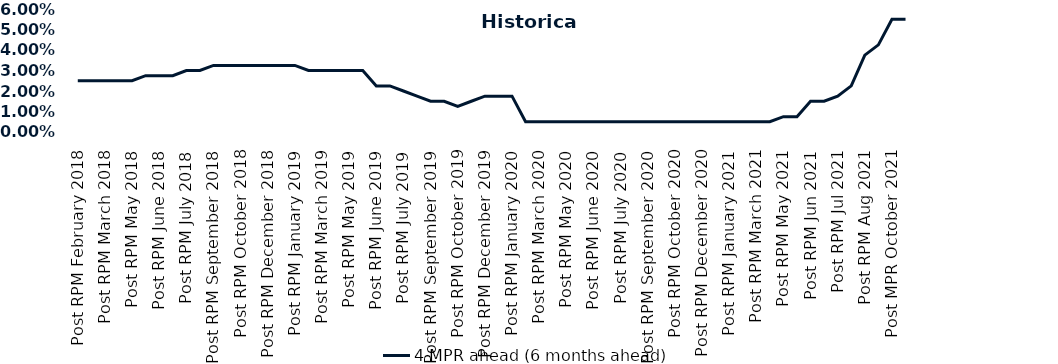
| Category | 4 MPR ahead (6 months ahead) |
|---|---|
| Post RPM February 2018 | 0.025 |
| Pre RPM March 2018 | 0.025 |
| Post RPM March 2018 | 0.025 |
| Pre RPM May 2018 | 0.025 |
| Post RPM May 2018 | 0.025 |
| Pre RPM June 2018 | 0.028 |
| Post RPM June 2018 | 0.028 |
| Pre RPM July 2018 | 0.028 |
| Post RPM July 2018 | 0.03 |
| Pre RPM September 2018 | 0.03 |
| Post RPM September 2018 | 0.032 |
| Pre RPM October 2018 | 0.032 |
| Post RPM October 2018 | 0.032 |
| Pre RPM December 2018 | 0.032 |
| Post RPM December 2018 | 0.032 |
| Pre RPM January 2019 | 0.032 |
| Post RPM January 2019 | 0.032 |
| Pre RPM March 2019 | 0.03 |
| Post RPM March 2019 | 0.03 |
| Pre RPM May 2019 | 0.03 |
| Post RPM May 2019 | 0.03 |
| Pre RPM June 2019 | 0.03 |
| Post RPM June 2019 | 0.022 |
| Pre RPM July 2019 | 0.022 |
| Post RPM July 2019 | 0.02 |
| Pre RPM September 2019 | 0.018 |
| Post RPM September 2019 | 0.015 |
| Pre RPM October 2019 | 0.015 |
| Post RPM October 2019 | 0.012 |
| Pre RPM December 2019 | 0.015 |
| Post RPM December 2019 | 0.018 |
| Pre RPM January 2020 | 0.018 |
| Post RPM January 2020 | 0.018 |
| Pre RPM March 2020 | 0.005 |
| Post RPM March 2020 | 0.005 |
| Pre RPM May 2020 | 0.005 |
| Post RPM May 2020 | 0.005 |
| Pre RPM June 2020 | 0.005 |
| Post RPM June 2020 | 0.005 |
| Pre RPM July 2020 | 0.005 |
| Post RPM July 2020 | 0.005 |
| Pre RPM September 2020 | 0.005 |
| Post RPM September 2020 | 0.005 |
| Pre RPM October 2020 | 0.005 |
| Post RPM October 2020 | 0.005 |
| Pre RPM December 2020 | 0.005 |
|  Post RPM December 2020 | 0.005 |
| Pre RPM January 2021 | 0.005 |
| Post RPM January 2021 | 0.005 |
|  Pre RPM March 2021 | 0.005 |
|  Post RPM March 2021 | 0.005 |
|  Pre RPM May 2021 | 0.005 |
|  Post RPM May 2021 | 0.008 |
|  Pre RPM Jun 2021 | 0.008 |
|   Post RPM Jun 2021 | 0.015 |
| Pre RPM Jul 2021 | 0.015 |
|  Post RPM Jul 2021 | 0.018 |
| Pre RPM Aug 2021 | 0.022 |
|  Post RPM Aug 2021 | 0.038 |
| Pre MPR October 2021 | 0.042 |
| Post MPR October 2021 | 0.055 |
| Pre MPR December 2021 | 0.055 |